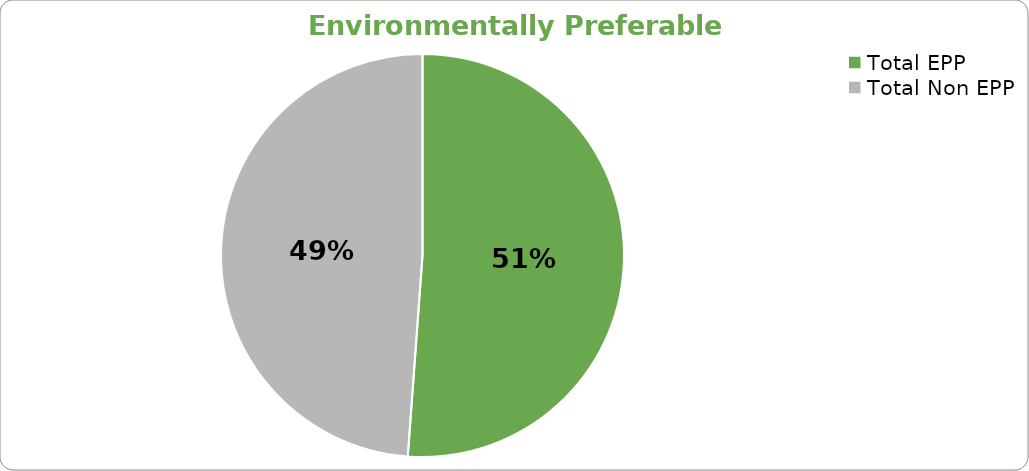
| Category | Series 0 |
|---|---|
| Total EPP | 22 |
| Total Non EPP | 21 |